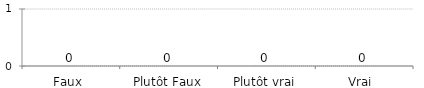
| Category | Véracité Critères |
|---|---|
| Faux  | 0 |
| Plutôt Faux | 0 |
| Plutôt vrai | 0 |
| Vrai  | 0 |